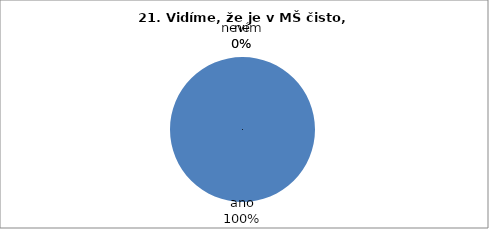
| Category | 21. |
|---|---|
| ano | 54 |
| ne | 0 |
| nevím | 0 |